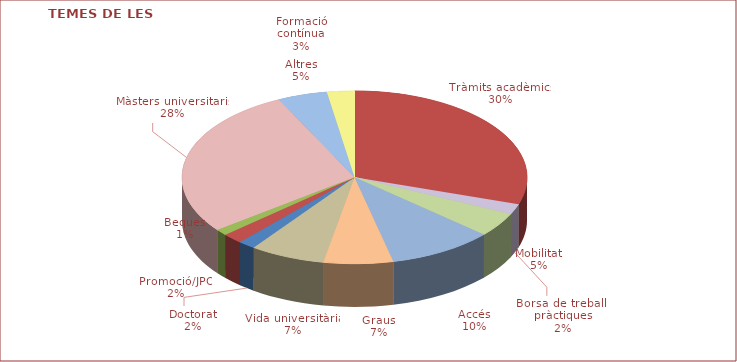
| Category | Series 0 |
|---|---|
| Tràmits acadèmics | 0.3 |
| Borsa de treball i pràctiques | 0.019 |
| Mobilitat | 0.045 |
| Accés | 0.099 |
| Graus | 0.065 |
| Vida universitària | 0.07 |
| Doctorat | 0.016 |
| Promoció/JPO | 0.019 |
| Beques | 0.011 |
| Màsters universitaris | 0.282 |
| Altres | 0.047 |
| Formació contínua | 0.026 |